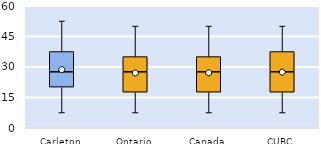
| Category | 25th | 50th | 75th |
|---|---|---|---|
| Carleton | 20 | 7.5 | 10 |
| Ontario | 17.5 | 10 | 7.5 |
| Canada | 17.5 | 10 | 7.5 |
| CUBC | 17.5 | 10 | 10 |